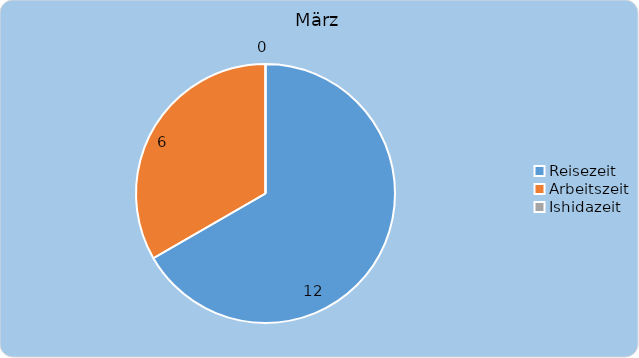
| Category | März |
|---|---|
| Reisezeit | 12 |
| Arbeitszeit | 6 |
| Ishidazeit | 0 |